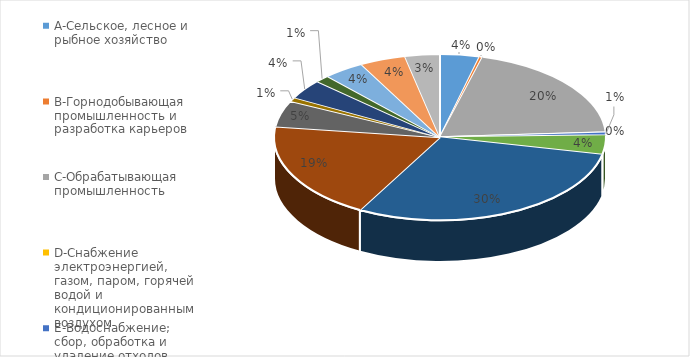
| Category |  Доля, %  |
|---|---|
| A-Сельское, лесное и рыбное хозяйство | 0.039 |
| B-Горнодобывающая промышленность и разработка карьеров | 0.003 |
| C-Обрабатывающая промышленность | 0.199 |
| D-Снабжение электроэнергией, газом, паром, горячей водой и  кондиционированным воздухом | 0.001 |
| E-Водоснабжение; сбор, обработка и удаление отходов, деятельность по ликвидации загрязнений | 0.005 |
| F-Строительство | 0.037 |
| G-Оптовая и розничная торговля; ремонт автомобилей и мотоциклов | 0.296 |
| H-Транспорт и складирование | 0.19 |
| I-Предоставление услуг по проживанию и питанию | 0.051 |
| J-Информация и связь | 0.008 |
| L-Операции с недвижимым имуществом | 0.038 |
| M-Профессиональная, научная и техническая деятельность | 0.014 |
| N-Деятельность в области административного и вспомогательного обслуживания | 0.04 |
| P-Образование | 0.045 |
| Q-Здравоохранение и социальное обслуживание населения | 0.034 |